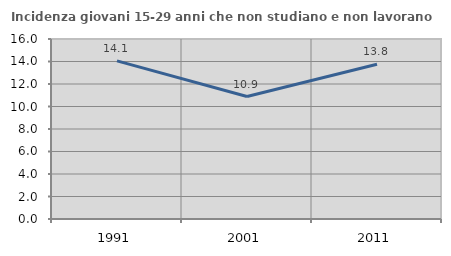
| Category | Incidenza giovani 15-29 anni che non studiano e non lavorano  |
|---|---|
| 1991.0 | 14.058 |
| 2001.0 | 10.884 |
| 2011.0 | 13.761 |